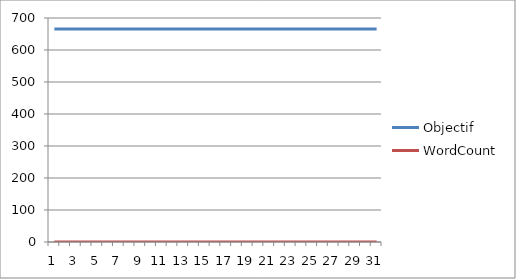
| Category | Objectif | WordCount |
|---|---|---|
| 0 | 666 | 0 |
| 1 | 666 | 0 |
| 2 | 666 | 0 |
| 3 | 666 | 0 |
| 4 | 666 | 0 |
| 5 | 666 | 0 |
| 6 | 666 | 0 |
| 7 | 666 | 0 |
| 8 | 666 | 0 |
| 9 | 666 | 0 |
| 10 | 666 | 0 |
| 11 | 666 | 0 |
| 12 | 666 | 0 |
| 13 | 666 | 0 |
| 14 | 666 | 0 |
| 15 | 666 | 0 |
| 16 | 666 | 0 |
| 17 | 666 | 0 |
| 18 | 666 | 0 |
| 19 | 666 | 0 |
| 20 | 666 | 0 |
| 21 | 666 | 0 |
| 22 | 666 | 0 |
| 23 | 666 | 0 |
| 24 | 666 | 0 |
| 25 | 666 | 0 |
| 26 | 666 | 0 |
| 27 | 666 | 0 |
| 28 | 666 | 0 |
| 29 | 666 | 0 |
| 30 | 666 | 0 |